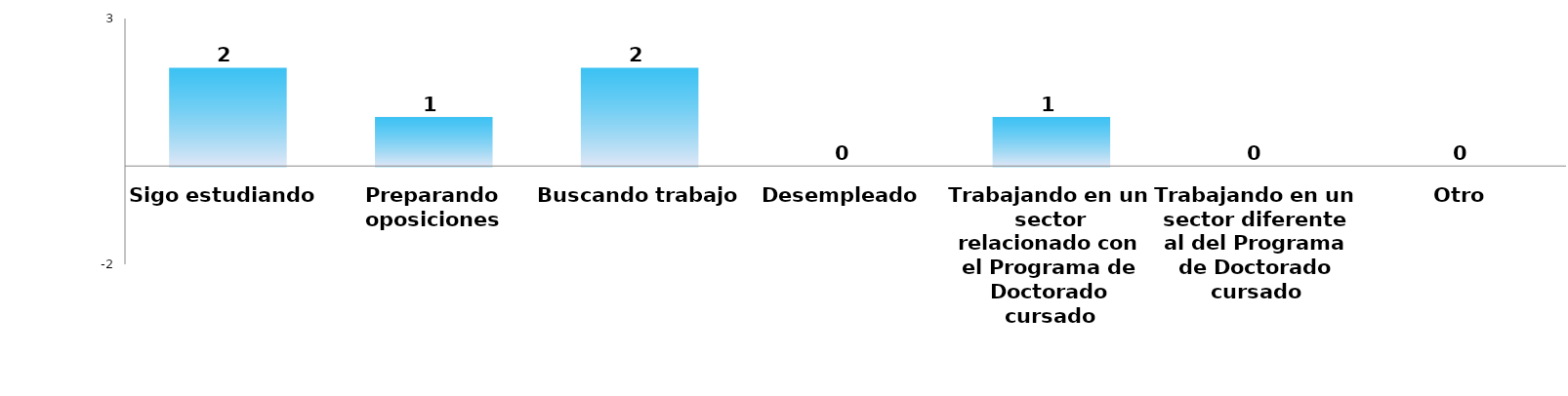
| Category | Series 0 |
|---|---|
| Sigo estudiando | 2 |
| Preparando oposiciones | 1 |
| Buscando trabajo | 2 |
| Desempleado | 0 |
| Trabajando en un sector relacionado con el Programa de Doctorado cursado | 1 |
| Trabajando en un sector diferente al del Programa de Doctorado cursado | 0 |
| Otro | 0 |